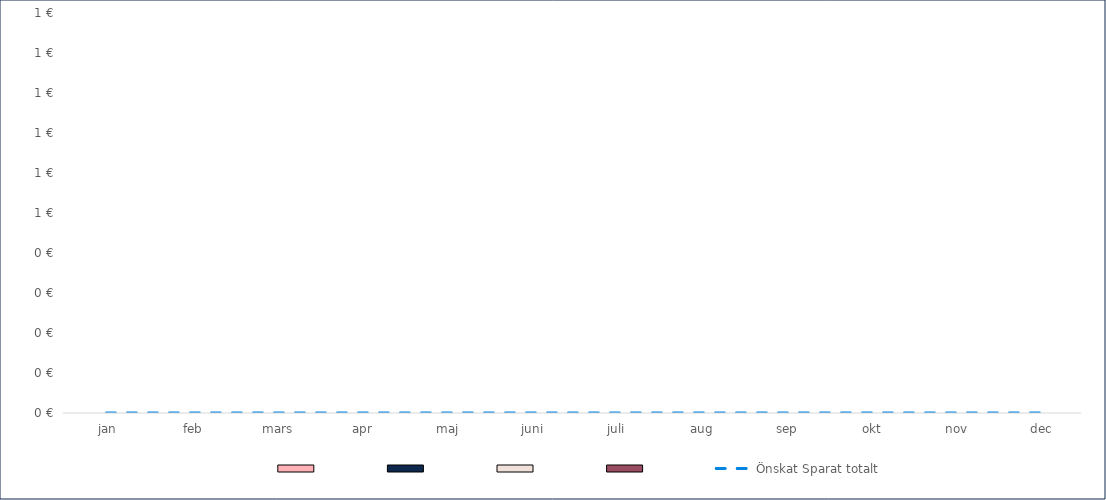
| Category | Series 4 | Series 1 | Series 2 | Series 3 |
|---|---|---|---|---|
| 0 | 0 | 0 | 0 | 0 |
| 1 | 0 | 0 | 0 | 0 |
| 2 | 0 | 0 | 0 | 0 |
| 3 | 0 | 0 | 0 | 0 |
| 4 | 0 | 0 | 0 | 0 |
| 5 | 0 | 0 | 0 | 0 |
| 6 | 0 | 0 | 0 | 0 |
| 7 | 0 | 0 | 0 | 0 |
| 8 | 0 | 0 | 0 | 0 |
| 9 | 0 | 0 | 0 | 0 |
| 10 | 0 | 0 | 0 | 0 |
| 11 | 0 | 0 | 0 | 0 |